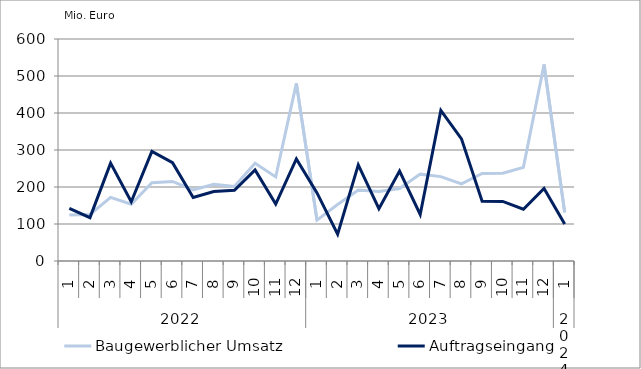
| Category | Baugewerblicher Umsatz | Auftragseingang |
|---|---|---|
| 0 | 124217.549 | 142351.759 |
| 1 | 125619.696 | 117194.423 |
| 2 | 171896.664 | 264509.013 |
| 3 | 153384.654 | 160146.519 |
| 4 | 211335.38 | 295997.826 |
| 5 | 214914.164 | 265813.917 |
| 6 | 192047.613 | 171529.517 |
| 7 | 207577.681 | 187809.656 |
| 8 | 201109.781 | 190941.096 |
| 9 | 264135.048 | 246250.021 |
| 10 | 227299.047 | 153783.993 |
| 11 | 480026.589 | 276019.328 |
| 12 | 110408.991 | 184068.731 |
| 13 | 152702.87 | 72330.186 |
| 14 | 191677.032 | 259741.102 |
| 15 | 187876.702 | 141464.389 |
| 16 | 195815.34 | 243069.898 |
| 17 | 234759.067 | 125882.939 |
| 18 | 228043.08 | 406932.293 |
| 19 | 208510.786 | 330128.024 |
| 20 | 236511.503 | 161760.047 |
| 21 | 237275.194 | 161029.305 |
| 22 | 252921.567 | 139832.011 |
| 23 | 530955.69 | 196157.417 |
| 24 | 131309.627 | 99926.857 |